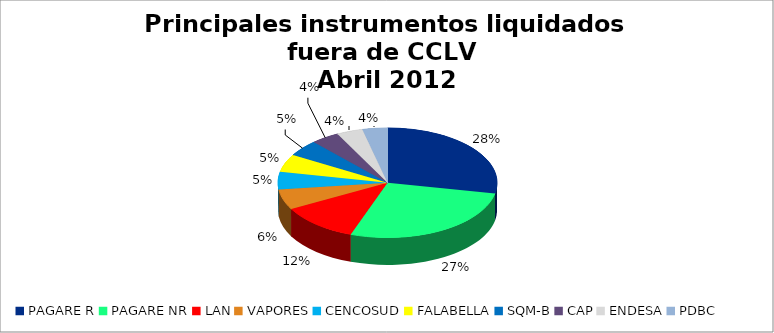
| Category | Series 0 |
|---|---|
| PAGARE R | 2162 |
| PAGARE NR | 2098 |
| LAN | 895 |
| VAPORES | 457 |
| CENCOSUD | 401 |
| FALABELLA | 401 |
| SQM-B | 372 |
| CAP | 320 |
| ENDESA | 297 |
| PDBC | 283 |